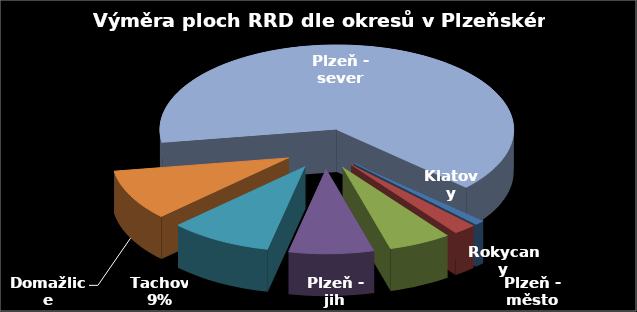
| Category | Výměra [ha] |
|---|---|
| Plzeň - město | 7.25 |
| Rokycany | 16.92 |
| Klatovy | 46.37 |
| Plzeň - jih | 63.06 |
| Tachov | 76.2 |
| Domažlice | 78.78 |
| Plzeň - sever | 523.14 |